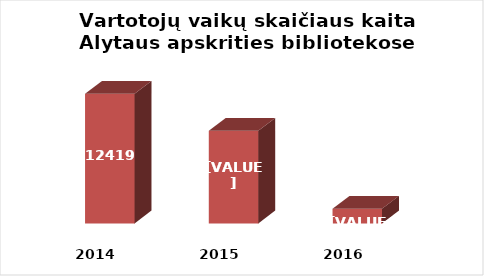
| Category | Series 0 |
|---|---|
| 2014.0 | 12419 |
| 2015.0 | 12015 |
| 2016.0 | 11161 |